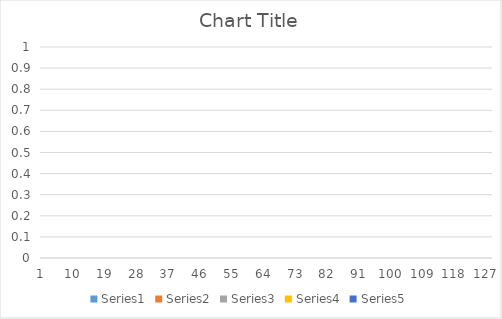
| Category | Series 0 | Series 1 | Series 2 | Series 3 | Series 4 |
|---|---|---|---|---|---|
| 0 | 0 | 0 | 0 | 0 | 0 |
| 1 | 0 | 0 | 0 | 0 | 0 |
| 2 | 0 | 0 | 0 | 0 | 0 |
| 3 | 0 | 0 | 0 | 0 | 0 |
| 4 | 0 | 0 | 0 | 0 | 0 |
| 5 | 0 | 0 | 0 | 0 | 0 |
| 6 | 0 | 0 | 0 | 0 | 0 |
| 7 | 0 | 0 | 0 | 0 | 0 |
| 8 | 0 | 0 | 0 | 0 | 0 |
| 9 | 0 | 0 | 0 | 0 | 0 |
| 10 | 0 | 0 | 0 | 0 | 0 |
| 11 | 0 | 0 | 0 | 0 | 0 |
| 12 | 0 | 0 | 0 | 0 | 0 |
| 13 | 0 | 0 | 0 | 0 | 0 |
| 14 | 0 | 0 | 0 | 0 | 0 |
| 15 | 0 | 0 | 0 | 0 | 0 |
| 16 | 0 | 0 | 0 | 0 | 0 |
| 17 | 0 | 0 | 0 | 0 | 0 |
| 18 | 0 | 0 | 0 | 0 | 0 |
| 19 | 0 | 0 | 0 | 0 | 0 |
| 20 | 0 | 0 | 0 | 0 | 0 |
| 21 | 0 | 0 | 0 | 0 | 0 |
| 22 | 0 | 0 | 0 | 0 | 0 |
| 23 | 0 | 0 | 0 | 0 | 0 |
| 24 | 0 | 0 | 0 | 0 | 0 |
| 25 | 0 | 0 | 0 | 0 | 0 |
| 26 | 0 | 0 | 0 | 0 | 0 |
| 27 | 0 | 0 | 0 | 0 | 0 |
| 28 | 0 | 0 | 0 | 0 | 0 |
| 29 | 0 | 0 | 0 | 0 | 0 |
| 30 | 0 | 0 | 0 | 0 | 0 |
| 31 | 0 | 0 | 0 | 0 | 0 |
| 32 | 0 | 0 | 0 | 0 | 0 |
| 33 | 0 | 0 | 0 | 0 | 0 |
| 34 | 0 | 0 | 0 | 0 | 0 |
| 35 | 0 | 0 | 0 | 0 | 0 |
| 36 | 0 | 0 | 0 | 0 | 0 |
| 37 | 0 | 0 | 0 | 0 | 0 |
| 38 | 0 | 0 | 0 | 0 | 0 |
| 39 | 0 | 0 | 0 | 0 | 0 |
| 40 | 0 | 0 | 0 | 0 | 0 |
| 41 | 0 | 0 | 0 | 0 | 0 |
| 42 | 0 | 0 | 0 | 0 | 0 |
| 43 | 0 | 0 | 0 | 0 | 0 |
| 44 | 0 | 0 | 0 | 0 | 0 |
| 45 | 0 | 0 | 0 | 0 | 0 |
| 46 | 0 | 0 | 0 | 0 | 0 |
| 47 | 0 | 0 | 0 | 0 | 0 |
| 48 | 0 | 0 | 0 | 0 | 0 |
| 49 | 0 | 0 | 0 | 0 | 0 |
| 50 | 0 | 0 | 0 | 0 | 0 |
| 51 | 0 | 0 | 0 | 0 | 0 |
| 52 | 0 | 0 | 0 | 0 | 0 |
| 53 | 0 | 0 | 0 | 0 | 0 |
| 54 | 0 | 0 | 0 | 0 | 0 |
| 55 | 0 | 0 | 0 | 0 | 0 |
| 56 | 0 | 0 | 0 | 0 | 0 |
| 57 | 0 | 0 | 0 | 0 | 0 |
| 58 | 0 | 0 | 0 | 0 | 0 |
| 59 | 0 | 0 | 0 | 0 | 0 |
| 60 | 0 | 0 | 0 | 0 | 0 |
| 61 | 0 | 0 | 0 | 0 | 0 |
| 62 | 0 | 0 | 0 | 0 | 0 |
| 63 | 0 | 0 | 0 | 0 | 0 |
| 64 | 0 | 0 | 0 | 0 | 0 |
| 65 | 0 | 0 | 0 | 0 | 0 |
| 66 | 0 | 0 | 0 | 0 | 0 |
| 67 | 0 | 0 | 0 | 0 | 0 |
| 68 | 0 | 0 | 0 | 0 | 0 |
| 69 | 0 | 0 | 0 | 0 | 0 |
| 70 | 0 | 0 | 0 | 0 | 0 |
| 71 | 0 | 0 | 0 | 0 | 0 |
| 72 | 0 | 0 | 0 | 0 | 0 |
| 73 | 0 | 0 | 0 | 0 | 0 |
| 74 | 0 | 0 | 0 | 0 | 0 |
| 75 | 0 | 0 | 0 | 0 | 0 |
| 76 | 0 | 0 | 0 | 0 | 0 |
| 77 | 0 | 0 | 0 | 0 | 0 |
| 78 | 0 | 0 | 0 | 0 | 0 |
| 79 | 0 | 0 | 0 | 0 | 0 |
| 80 | 0 | 0 | 0 | 0 | 0 |
| 81 | 0 | 0 | 0 | 0 | 0 |
| 82 | 0 | 0 | 0 | 0 | 0 |
| 83 | 0 | 0 | 0 | 0 | 0 |
| 84 | 0 | 0 | 0 | 0 | 0 |
| 85 | 0 | 0 | 0 | 0 | 0 |
| 86 | 0 | 0 | 0 | 0 | 0 |
| 87 | 0 | 0 | 0 | 0 | 0 |
| 88 | 0 | 0 | 0 | 0 | 0 |
| 89 | 0 | 0 | 0 | 0 | 0 |
| 90 | 0 | 0 | 0 | 0 | 0 |
| 91 | 0 | 0 | 0 | 0 | 0 |
| 92 | 0 | 0 | 0 | 0 | 0 |
| 93 | 0 | 0 | 0 | 0 | 0 |
| 94 | 0 | 0 | 0 | 0 | 0 |
| 95 | 0 | 0 | 0 | 0 | 0 |
| 96 | 0 | 0 | 0 | 0 | 0 |
| 97 | 0 | 0 | 0 | 0 | 0 |
| 98 | 0 | 0 | 0 | 0 | 0 |
| 99 | 0 | 0 | 0 | 0 | 0 |
| 100 | 0 | 0 | 0 | 0 | 0 |
| 101 | 0 | 0 | 0 | 0 | 0 |
| 102 | 0 | 0 | 0 | 0 | 0 |
| 103 | 0 | 0 | 0 | 0 | 0 |
| 104 | 0 | 0 | 0 | 0 | 0 |
| 105 | 0 | 0 | 0 | 0 | 0 |
| 106 | 0 | 0 | 0 | 0 | 0 |
| 107 | 0 | 0 | 0 | 0 | 0 |
| 108 | 0 | 0 | 0 | 0 | 0 |
| 109 | 0 | 0 | 0 | 0 | 0 |
| 110 | 0 | 0 | 0 | 0 | 0 |
| 111 | 0 | 0 | 0 | 0 | 0 |
| 112 | 0 | 0 | 0 | 0 | 0 |
| 113 | 0 | 0 | 0 | 0 | 0 |
| 114 | 0 | 0 | 0 | 0 | 0 |
| 115 | 0 | 0 | 0 | 0 | 0 |
| 116 | 0 | 0 | 0 | 0 | 0 |
| 117 | 0 | 0 | 0 | 0 | 0 |
| 118 | 0 | 0 | 0 | 0 | 0 |
| 119 | 0 | 0 | 0 | 0 | 0 |
| 120 | 0 | 0 | 0 | 0 | 0 |
| 121 | 0 | 0 | 0 | 0 | 0 |
| 122 | 0 | 0 | 0 | 0 | 0 |
| 123 | 0 | 0 | 0 | 0 | 0 |
| 124 | 0 | 0 | 0 | 0 | 0 |
| 125 | 0 | 0 | 0 | 0 | 0 |
| 126 | 0 | 0 | 0 | 0 | 0 |
| 127 | 0 | 0 | 0 | 0 | 0 |